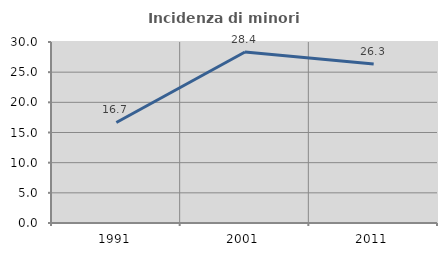
| Category | Incidenza di minori stranieri |
|---|---|
| 1991.0 | 16.667 |
| 2001.0 | 28.352 |
| 2011.0 | 26.336 |